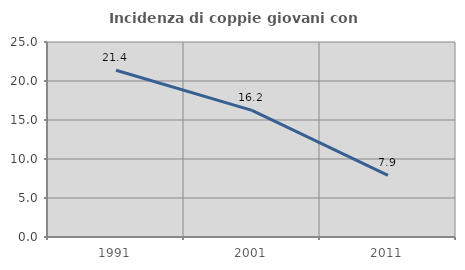
| Category | Incidenza di coppie giovani con figli |
|---|---|
| 1991.0 | 21.376 |
| 2001.0 | 16.227 |
| 2011.0 | 7.905 |